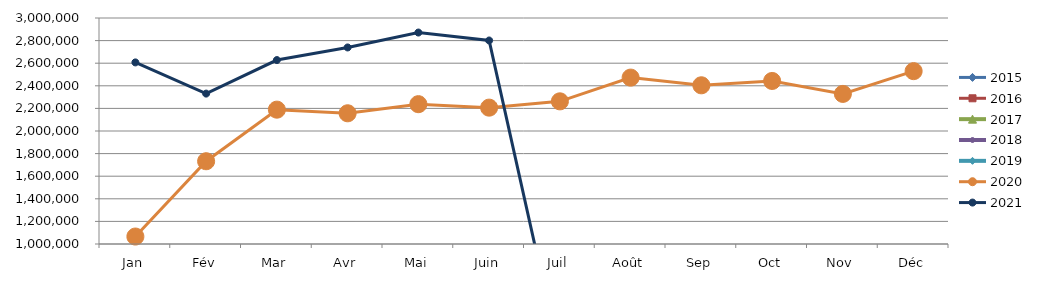
| Category | 2015 | 2016 | 2017 | 2018 | 2019 | 2020 | 2021 |
|---|---|---|---|---|---|---|---|
| Jan | 0 | 0 | 0 | 0 | 0 | 1065914.395 | 2606997.263 |
| Fév | 0 | 0 | 0 | 0 | 0 | 1732446.596 | 2330972.971 |
| Mar | 0 | 0 | 0 | 0 | 0 | 2188822.187 | 2627784.258 |
| Avr | 0 | 0 | 0 | 0 | 0 | 2156692.388 | 2739322.316 |
| Mai | 0 | 0 | 0 | 0 | 0 | 2237302.96 | 2871301.078 |
| Juin | 0 | 0 | 0 | 0 | 0 | 2206664.409 | 2800973.605 |
| Juil | 0 | 0 | 0 | 0 | 0 | 2262469.236 | 0 |
| Août | 0 | 0 | 0 | 0 | 0 | 2472399.146 | 0 |
| Sep | 0 | 0 | 0 | 0 | 0 | 2404432.621 | 0 |
| Oct | 0 | 0 | 0 | 0 | 0 | 2442779.508 | 0 |
| Nov | 0 | 0 | 0 | 0 | 0 | 2328229.47 | 0 |
| Déc | 0 | 0 | 0 | 0 | 0 | 2529675.124 | 0 |